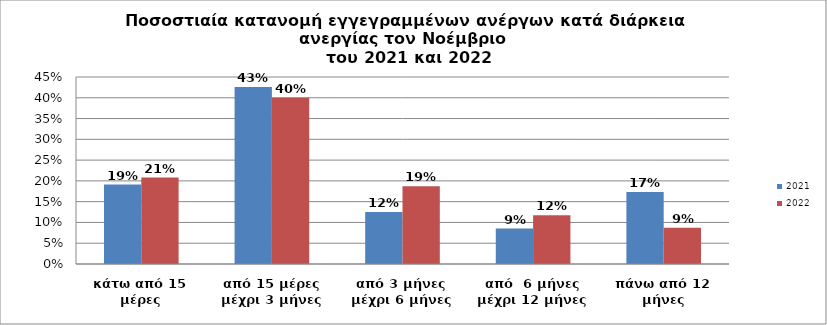
| Category | 2021 | 2022 |
|---|---|---|
| κάτω από 15 μέρες | 0.191 | 0.208 |
| από 15 μέρες μέχρι 3 μήνες | 0.426 | 0.4 |
| από 3 μήνες μέχρι 6 μήνες | 0.125 | 0.187 |
| από  6 μήνες μέχρι 12 μήνες | 0.085 | 0.117 |
| πάνω από 12 μήνες | 0.173 | 0.087 |